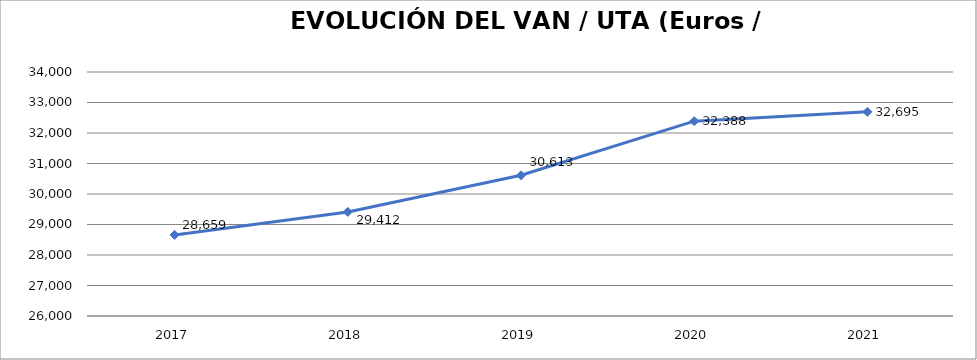
| Category | 2017 |
|---|---|
| 2017.0 | 28658.931 |
| 2018.0 | 29411.901 |
| 2019.0 | 30613.131 |
| 2020.0 | 32387.892 |
| 2021.0 | 32695 |